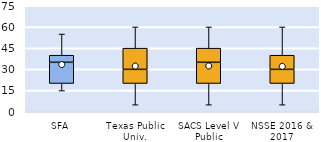
| Category | 25th | 50th | 75th |
|---|---|---|---|
| SFA | 20 | 15 | 5 |
| Texas Public Univ. | 20 | 10 | 15 |
| SACS Level V Public | 20 | 15 | 10 |
| NSSE 2016 & 2017 | 20 | 10 | 10 |